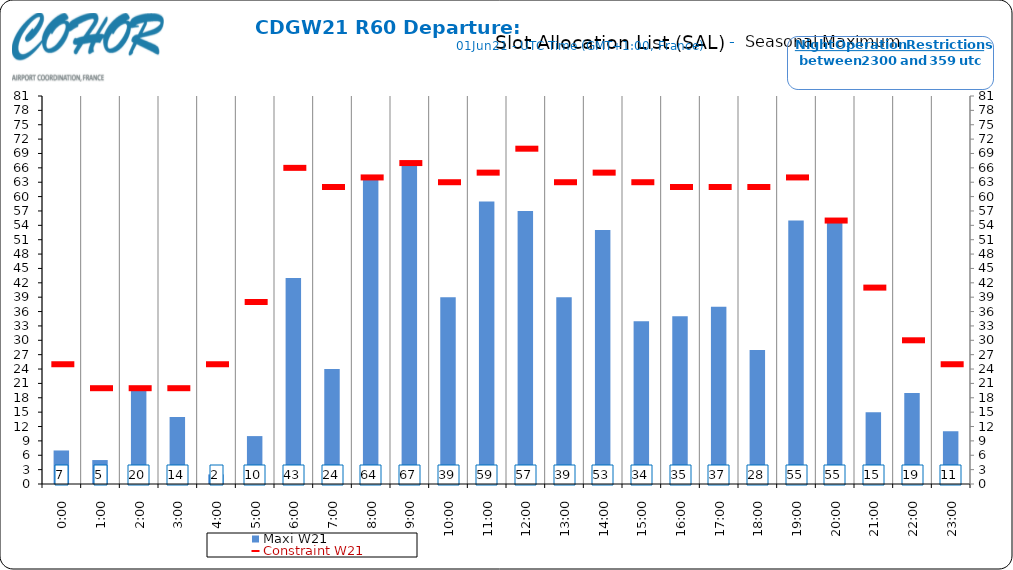
| Category | Maxi W21 |
|---|---|
| 0:00 | 7 |
| 1:00 | 5 |
| 2:00 | 20 |
| 3:00 | 14 |
| 4:00 | 2 |
| 5:00 | 10 |
| 6:00 | 43 |
| 7:00 | 24 |
| 8:00 | 64 |
| 9:00 | 67 |
| 10:00 | 39 |
| 11:00 | 59 |
| 12:00 | 57 |
| 13:00 | 39 |
| 14:00 | 53 |
| 15:00 | 34 |
| 16:00 | 35 |
| 17:00 | 37 |
| 18:00 | 28 |
| 19:00 | 55 |
| 20:00 | 55 |
| 21:00 | 15 |
| 22:00 | 19 |
| 23:00 | 11 |